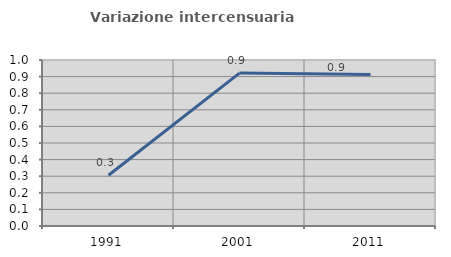
| Category | Variazione intercensuaria annua |
|---|---|
| 1991.0 | 0.306 |
| 2001.0 | 0.921 |
| 2011.0 | 0.912 |